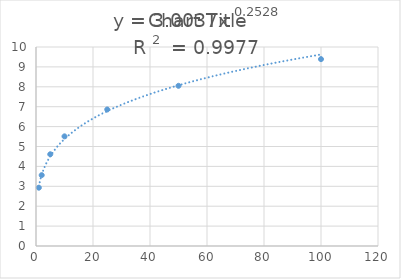
| Category | Series 0 |
|---|---|
| 1.0 | 2.93 |
| 2.0 | 3.56 |
| 5.0 | 4.61 |
| 10.0 | 5.51 |
| 25.0 | 6.86 |
| 50.0 | 8.05 |
| 100.0 | 9.39 |